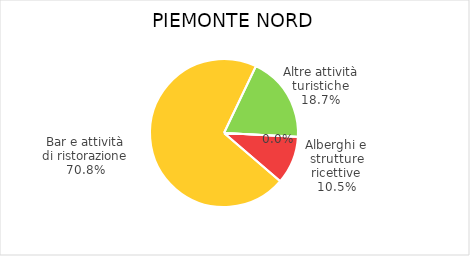
| Category | Piemonte Nord |
|---|---|
| Alberghi e strutture ricettive | 919 |
| Bar e attività di ristorazione | 6223 |
| Altre attività turistiche | 1648 |